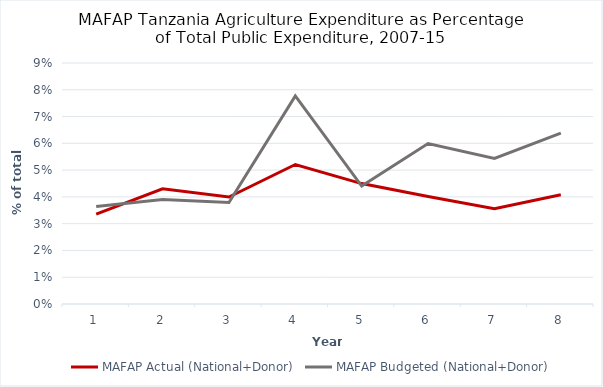
| Category | MAFAP Actual (National+Donor) | MAFAP Budgeted (National+Donor) |
|---|---|---|
| 0 | 0.034 | 0.036 |
| 1 | 0.043 | 0.039 |
| 2 | 0.04 | 0.038 |
| 3 | 0.052 | 0.078 |
| 4 | 0.045 | 0.044 |
| 5 | 0.04 | 0.06 |
| 6 | 0.036 | 0.054 |
| 7 | 0.041 | 0.064 |